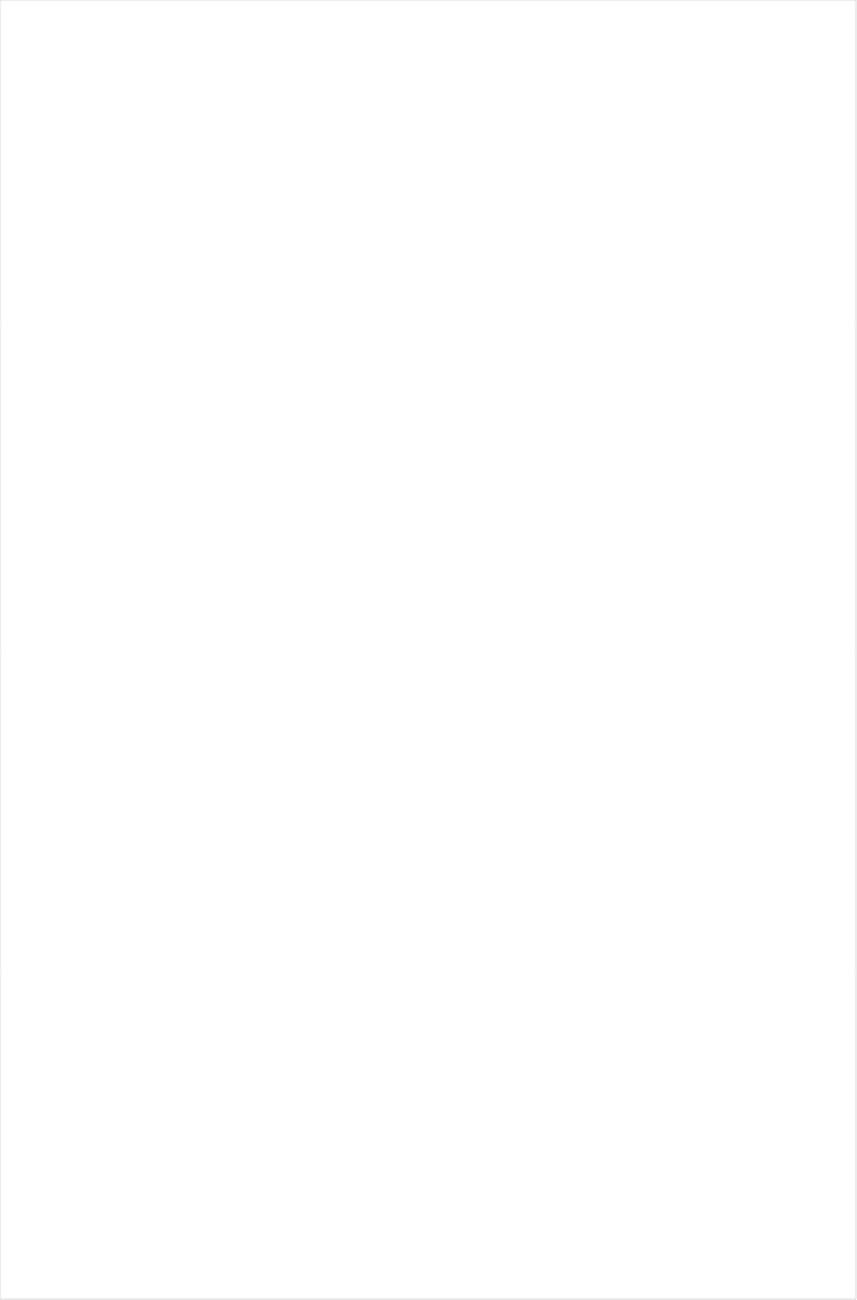
| Category | Total |
|---|---|
| Telemundo | -0.69 |
| UniMas | -0.685 |
| Univision | -0.625 |
| Galavision | -0.611 |
| NBC Universo | -0.602 |
| TUDN | -0.514 |
| Hallmark Movies & Mysteries | -0.289 |
| Cartoon Network | -0.285 |
| UP TV | -0.225 |
| Hallmark | -0.224 |
| Discovery Life Channel | -0.204 |
| Lifetime Movies | -0.172 |
| Nick Toons | -0.16 |
| TLC | -0.153 |
| Adult Swim | -0.141 |
| INSP | -0.131 |
| Logo | -0.13 |
| Disney XD | -0.126 |
| WE TV | -0.126 |
| Teen Nick | -0.12 |
| Travel | -0.108 |
| Nick | -0.106 |
| RFD TV | -0.106 |
| Nick@Nite | -0.105 |
| Investigation Discovery | -0.103 |
| Oprah Winfrey Network | -0.102 |
| Lifetime | -0.073 |
| OXYGEN | -0.068 |
| VH1 | -0.065 |
| Disney Channel | -0.063 |
| Nick Jr. | -0.047 |
| ION | -0.046 |
| PBS | -0.044 |
| BET | -0.043 |
| Discovery Family Channel | -0.023 |
| E! | -0.022 |
| TV LAND | -0.017 |
| Headline News | -0.013 |
| CW | -0.004 |
| Disney Junior US | -0.002 |
| CMTV | -0.002 |
| Freeform | -0.001 |
| Great American Country | 0.006 |
| BRAVO | 0.012 |
| POP | 0.015 |
| SYFY | 0.016 |
| Universal Kids | 0.016 |
| Weather Channel | 0.016 |
| National Geographic Wild | 0.02 |
| BET Her | 0.021 |
| MSNBC | 0.022 |
| Science Channel | 0.024 |
| MTV2 | 0.027 |
| HGTV | 0.032 |
| Animal Planet | 0.052 |
| FXDEP | 0.056 |
| History Channel | 0.07 |
| USA Network | 0.075 |
| Fox Business | 0.081 |
| A&E | 0.085 |
| MTV | 0.091 |
| TV ONE | 0.095 |
| FX Movie Channel | 0.097 |
| Motor Trend Network | 0.097 |
| Fox News | 0.098 |
| WGN America | 0.103 |
| FX | 0.103 |
| FXX | 0.105 |
| Ovation | 0.107 |
| NBC | 0.119 |
| DIY | 0.119 |
| CBS | 0.121 |
| TBS | 0.122 |
| FOX | 0.123 |
| Food Network | 0.125 |
| Destination America | 0.127 |
| FYI | 0.13 |
| Discovery Channel | 0.131 |
| Game Show | 0.131 |
| CNN | 0.137 |
| SundanceTV | 0.168 |
| Paramount Network | 0.172 |
| American Heroes Channel | 0.173 |
| BBC America | 0.176 |
| National Geographic | 0.178 |
| CNBC | 0.179 |
| Reelz Channel | 0.182 |
| Smithsonian | 0.183 |
| TNT | 0.185 |
| AMC | 0.198 |
| Outdoor Channel | 0.203 |
| Cooking Channel | 0.207 |
| Bloomberg HD | 0.215 |
| Independent Film (IFC) | 0.22 |
| truTV | 0.224 |
| ABC | 0.23 |
| The Sportsman Channel | 0.271 |
| Tennis Channel | 0.272 |
| Viceland | 0.276 |
| Comedy Central | 0.281 |
| Olympic Channel | 0.418 |
| MyNetworkTV | 0.531 |
| FOX Sports 2 | 0.534 |
| Fox Sports 1 | 0.587 |
| NBC Sports | 0.612 |
| Golf | 0.64 |
| MLB Network | 0.652 |
| NHL | 0.654 |
| Big Ten Network | 0.683 |
| NBA TV | 0.686 |
| ESPNEWS | 0.704 |
| PAC-12 Network | 0.715 |
| ESPN2 | 0.763 |
| ESPNU | 0.775 |
| CBS Sports | 0.798 |
| ESPN | 0.81 |
| ESPN Deportes | 0.911 |
| NFL Network | 0.936 |